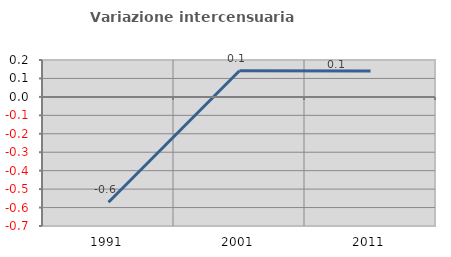
| Category | Variazione intercensuaria annua |
|---|---|
| 1991.0 | -0.571 |
| 2001.0 | 0.142 |
| 2011.0 | 0.14 |